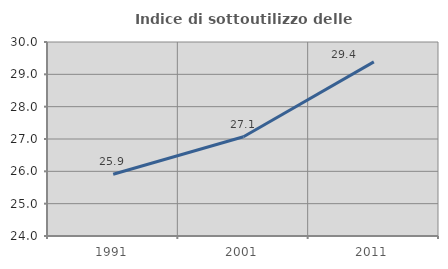
| Category | Indice di sottoutilizzo delle abitazioni  |
|---|---|
| 1991.0 | 25.909 |
| 2001.0 | 27.07 |
| 2011.0 | 29.385 |